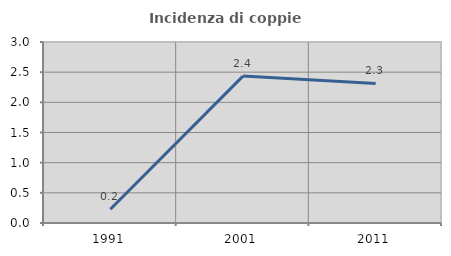
| Category | Incidenza di coppie miste |
|---|---|
| 1991.0 | 0.228 |
| 2001.0 | 2.434 |
| 2011.0 | 2.314 |